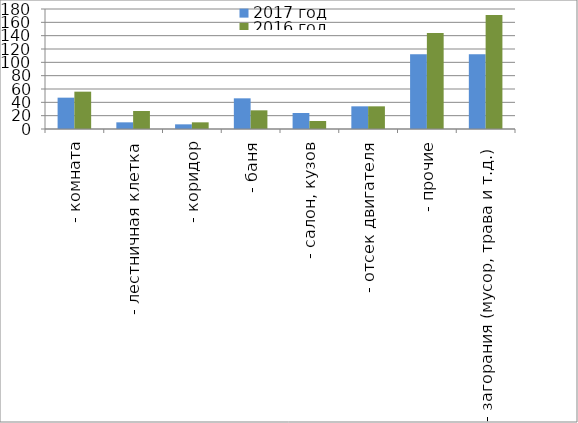
| Category | 2017 год | 2016 год |
|---|---|---|
|  - комната | 47 | 56 |
|  - лестничная клетка | 10 | 27 |
|  - коридор | 7 | 10 |
|  - баня | 46 | 28 |
|  - салон, кузов | 24 | 12 |
|  - отсек двигателя | 34 | 34 |
| - прочие | 112 | 144 |
| - загорания (мусор, трава и т.д.)  | 112 | 171 |